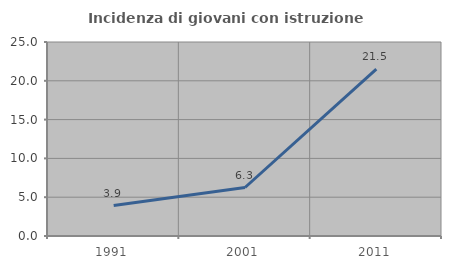
| Category | Incidenza di giovani con istruzione universitaria |
|---|---|
| 1991.0 | 3.922 |
| 2001.0 | 6.25 |
| 2011.0 | 21.495 |